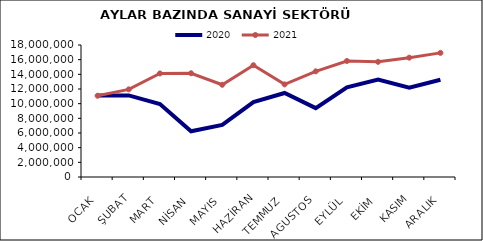
| Category | 2020 | 2021 |
|---|---|---|
| OCAK | 11098831.277 | 11079671.058 |
| ŞUBAT | 11121868.446 | 11949151.694 |
| MART | 9957580.698 | 14120285.567 |
| NİSAN | 6232426.892 | 14146166.369 |
| MAYIS | 7112851.616 | 12577211.596 |
| HAZİRAN | 10209118.648 | 15240610.718 |
| TEMMUZ | 11458297.939 | 12629278.972 |
| AGUSTOS | 9391473.351 | 14409205.92 |
| EYLÜL | 12224662.745 | 15821501.683 |
| EKİM | 13279520.495 | 15705309.787 |
| KASIM | 12173751.762 | 16275838.469 |
| ARALIK | 13269533.594 | 16926178.363 |